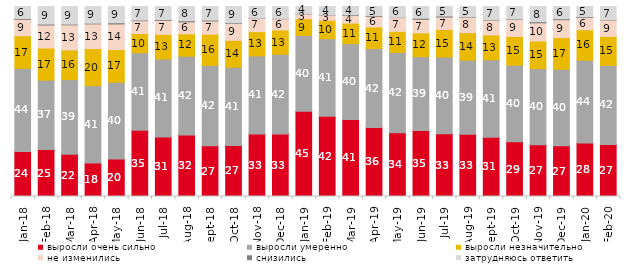
| Category | выросли очень сильно | выросли умеренно | выросли незначительно | не изменились | снизились | затрудняюсь ответить |
|---|---|---|---|---|---|---|
| 2018-01-01 | 23.75 | 43.7 | 17.15 | 8.65 | 0.45 | 6.3 |
| 2018-02-01 | 24.7 | 36.55 | 16.9 | 12.1 | 0.5 | 9.25 |
| 2018-03-01 | 22.25 | 39.3 | 15.6 | 13.2 | 0.4 | 9.25 |
| 2018-04-01 | 17.65 | 40.65 | 19.55 | 13 | 0.35 | 8.8 |
| 2018-05-01 | 19.75 | 40.4 | 17.15 | 13.5 | 0.65 | 8.55 |
| 2018-06-01 | 34.85 | 40.8 | 10.15 | 6.7 | 0.35 | 7.15 |
| 2018-07-01 | 31.3 | 41.05 | 12.9 | 7.4 | 0.45 | 6.85 |
| 2018-08-01 | 32.35 | 41.5 | 11.8 | 6.25 | 0.6 | 7.5 |
| 2018-09-01 | 26.7 | 42.3 | 16.4 | 7 | 0.45 | 7.15 |
| 2018-10-01 | 26.9 | 41.15 | 14.15 | 8.9 | 0.35 | 8.55 |
| 2018-11-01 | 32.934 | 41.068 | 12.774 | 7.036 | 0.1 | 6.088 |
| 2018-12-01 | 32.85 | 42 | 12.75 | 5.95 | 0.2 | 6.25 |
| 2019-01-01 | 44.85 | 39.95 | 8.75 | 2.6 | 0.2 | 3.65 |
| 2019-02-01 | 42.2 | 40.85 | 9.75 | 2.7 | 0.1 | 4.4 |
| 2019-03-01 | 40.527 | 39.881 | 10.84 | 4.177 | 0.348 | 4.227 |
| 2019-04-01 | 36.337 | 41.535 | 11.337 | 5.594 | 0.396 | 4.802 |
| 2019-05-01 | 33.531 | 42.298 | 11.095 | 7.231 | 0.149 | 5.696 |
| 2019-06-01 | 34.763 | 38.853 | 12.469 | 7.132 | 0.599 | 6.185 |
| 2019-07-01 | 32.97 | 40.446 | 14.505 | 6.535 | 0.545 | 5 |
| 2019-08-01 | 32.767 | 39.011 | 14.436 | 8.192 | 0.25 | 5.345 |
| 2019-09-01 | 31.188 | 40.743 | 13.069 | 7.871 | 0.248 | 6.881 |
| 2019-10-01 | 28.762 | 40.347 | 15.099 | 8.96 | 0.248 | 6.584 |
| 2019-11-01 | 27.178 | 40.149 | 14.505 | 9.554 | 0.594 | 8.02 |
| 2019-12-01 | 26.683 | 40.297 | 16.683 | 9.356 | 0.545 | 6.436 |
| 2020-01-01 | 28.218 | 43.515 | 16.04 | 6.436 | 0.396 | 5.396 |
| 2020-02-01 | 27.426 | 41.535 | 15.297 | 8.614 | 0.198 | 6.931 |